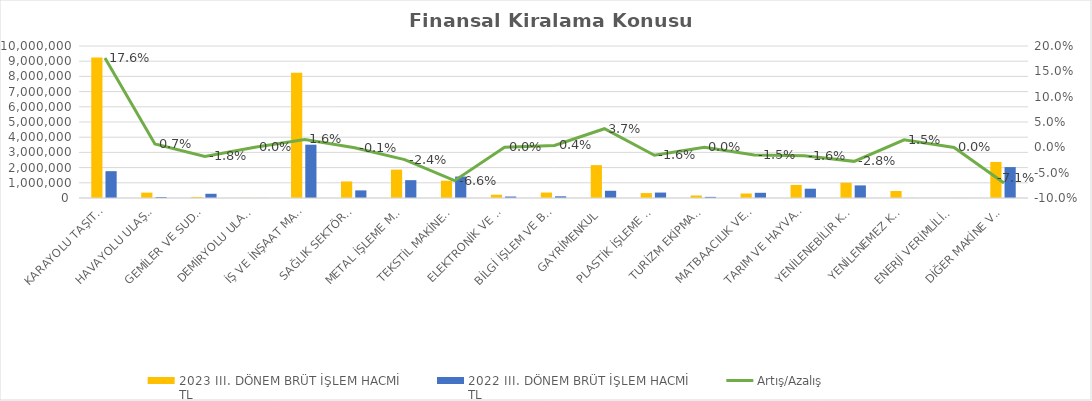
| Category | 2023 III. DÖNEM BRÜT İŞLEM HACMİ 
TL | 2022 III. DÖNEM BRÜT İŞLEM HACMİ 
TL |
|---|---|---|
| KARAYOLU TAŞITLARI | 9247449.053 | 1765147.1 |
| HAVAYOLU ULAŞIM ARAÇLARI | 353031 | 66604 |
| GEMİLER VE SUDA YÜZEN TAŞIT VE ARAÇLAR | 70126.241 | 277990.868 |
| DEMİRYOLU ULAŞIM ARAÇLARI | 13331 | 3944 |
| İŞ VE İNŞAAT MAKİNELERİ | 8243644.081 | 3506913.584 |
| SAĞLIK SEKTÖRÜ VE ESTETİK EKİPMANLARI | 1088274.495 | 500740.359 |
| METAL İŞLEME MAKİNELERİ | 1867906.336 | 1174083.776 |
| TEKSTİL MAKİNELERİ | 1139169.514 | 1411215.371 |
| ELEKTRONİK VE OPTİK CİHAZLAR | 215475.852 | 96028.759 |
| BİLGİ İŞLEM VE BÜRO SİSTEMLERİ | 358112.661 | 110060.118 |
| GAYRİMENKUL | 2164077.097 | 476141 |
| PLASTİK İŞLEME MAKİNELERİ | 322630.713 | 357907.05 |
| TURİZM EKİPMANLARI | 164379.767 | 73719.217 |
| MATBAACILIK VE KAĞIT İŞLEME MAKİNELERİ | 296230.065 | 342679.924 |
| TARIM VE HAYVANCILIK MAKİNELERİ | 860096.807 | 612015.652 |
| YENİLENEBİLİR KAYNAKLI ELEKTRİK ENERJİSİ ÜRETİM EKİPMANLARI | 1000952.609 | 829330.93 |
| YENİLENEMEZ KAYNAKLI ELEKTRİK ENERJİSİ ÜRETİM EKİPMANLARI | 458773 | 5003.788 |
| ENERJİ VERİMLİLİĞİ EKİPMANLARI | 0 | 3838 |
| DİĞER MAKİNE VE EKİPMANLAR | 2372860.161 | 2033147.214 |